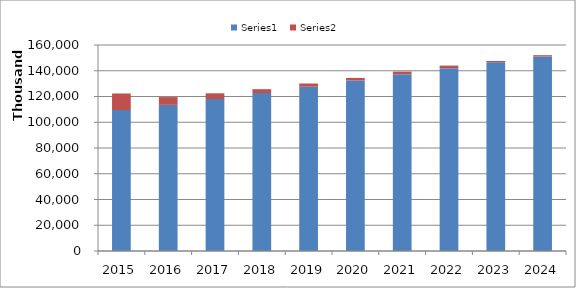
| Category | Series 0 | Series 1 |
|---|---|---|
| 2015.0 | 109487600 | 12861000 |
| 2016.0 | 113538641 | 6000000 |
| 2017.0 | 117966648 | 4500000 |
| 2018.0 | 122685314 | 3000000 |
| 2019.0 | 127592727 | 2500000 |
| 2020.0 | 132441251 | 2000000 |
| 2021.0 | 137341577 | 2000000 |
| 2022.0 | 142011191 | 2000000 |
| 2023.0 | 146555549 | 1000000 |
| 2024.0 | 151098771 | 1000000 |